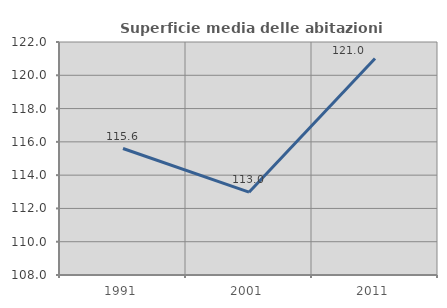
| Category | Superficie media delle abitazioni occupate |
|---|---|
| 1991.0 | 115.599 |
| 2001.0 | 112.976 |
| 2011.0 | 121.007 |